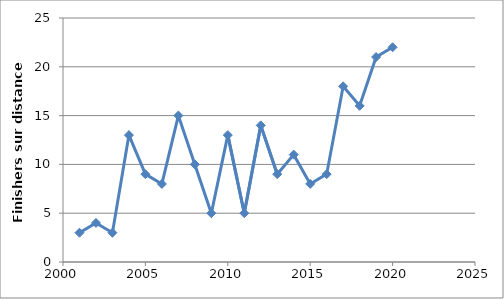
| Category | Series 0 |
|---|---|
| 2001.0 | 3 |
| 2002.0 | 4 |
| 2003.0 | 3 |
| 2004.0 | 13 |
| 2005.0 | 9 |
| 2006.0 | 8 |
| 2007.0 | 15 |
| 2008.0 | 10 |
| 2009.0 | 5 |
| 2010.0 | 13 |
| 2011.0 | 5 |
| 2012.0 | 14 |
| 2013.0 | 9 |
| 2014.0 | 11 |
| 2015.0 | 8 |
| 2016.0 | 9 |
| 2017.0 | 18 |
| 2018.0 | 16 |
| 2019.0 | 21 |
| 2020.0 | 22 |